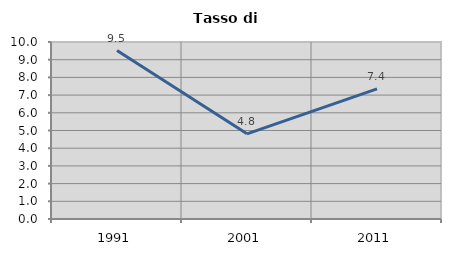
| Category | Tasso di disoccupazione   |
|---|---|
| 1991.0 | 9.516 |
| 2001.0 | 4.813 |
| 2011.0 | 7.356 |